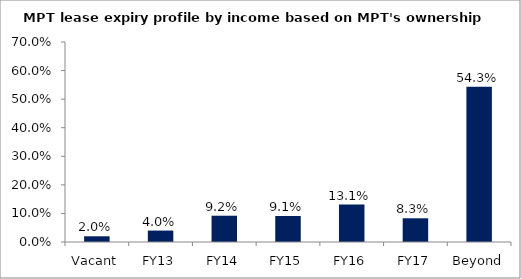
| Category | Series 0 |
|---|---|
| Vacant | 0.02 |
| FY13 | 0.04 |
| FY14 | 0.092 |
| FY15 | 0.091 |
| FY16 | 0.131 |
| FY17 | 0.083 |
| Beyond | 0.543 |